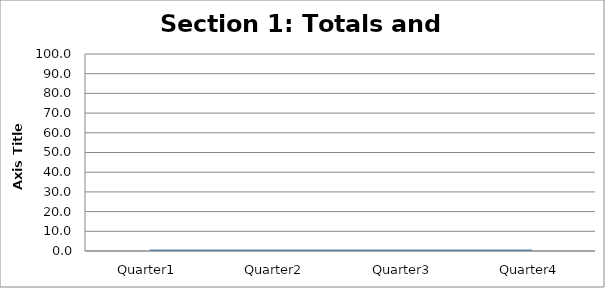
| Category | Section 1: Totals and Compliance |
|---|---|
| Quarter1 | 0 |
| Quarter2 | 0 |
| Quarter3 | 0 |
| Quarter4 | 0 |